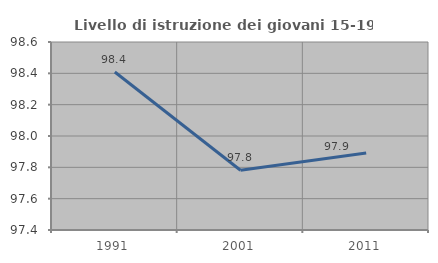
| Category | Livello di istruzione dei giovani 15-19 anni |
|---|---|
| 1991.0 | 98.408 |
| 2001.0 | 97.781 |
| 2011.0 | 97.891 |